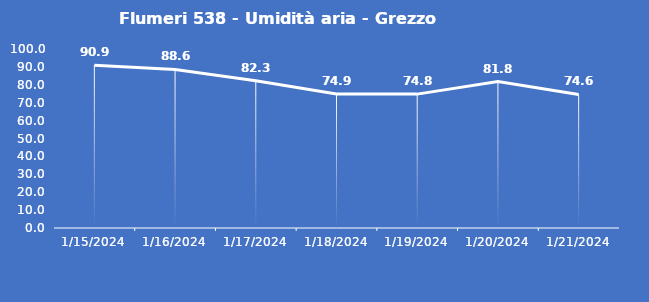
| Category | Flumeri 538 - Umidità aria - Grezzo (%) |
|---|---|
| 1/15/24 | 90.9 |
| 1/16/24 | 88.6 |
| 1/17/24 | 82.3 |
| 1/18/24 | 74.9 |
| 1/19/24 | 74.8 |
| 1/20/24 | 81.8 |
| 1/21/24 | 74.6 |